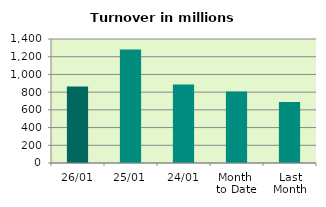
| Category | Series 0 |
|---|---|
| 26/01 | 863.704 |
| 25/01 | 1281.357 |
| 24/01 | 887.016 |
| Month 
to Date | 808.115 |
| Last
Month | 689.27 |